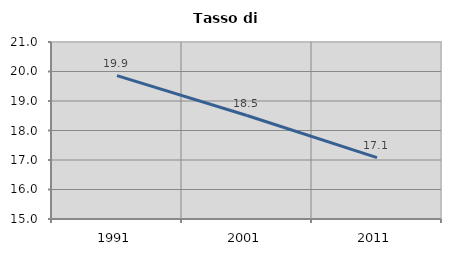
| Category | Tasso di disoccupazione   |
|---|---|
| 1991.0 | 19.862 |
| 2001.0 | 18.507 |
| 2011.0 | 17.08 |